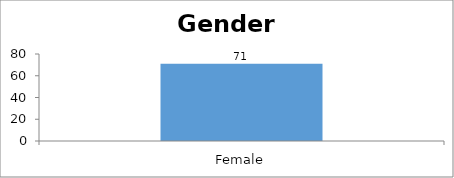
| Category | Gender |
|---|---|
| Female | 71 |